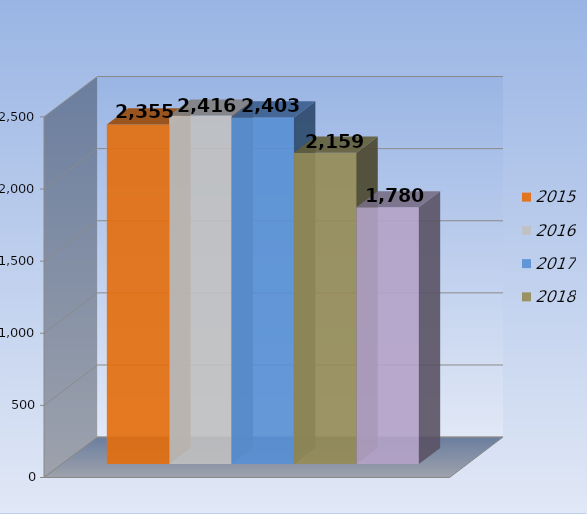
| Category | 2015 | 2016 | 2017 | 2018 | 2019 |
|---|---|---|---|---|---|
| 0 | 2355 | 2416 | 2403 | 2159 | 1780 |